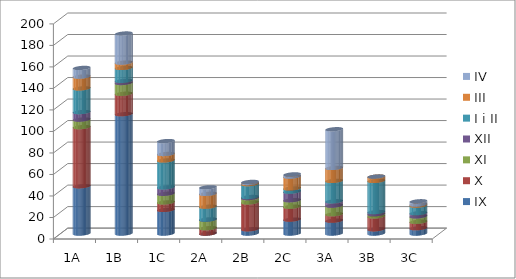
| Category | IX | X  | XI | XII | I i II | III | IV |
|---|---|---|---|---|---|---|---|
| 1A | 44 | 55 | 7 | 7 | 22 | 11 | 8 |
| 1B | 111 | 19 | 10 | 2 | 12 | 5 | 27 |
| 1C | 22 | 7 | 8 | 6 | 25 | 6 | 12 |
| 2A | 0 | 5 | 8 | 0 | 12 | 12 | 6 |
| 2B | 4 | 25 | 4 | 1 | 12 | 1 | 1 |
| 2C | 13 | 12 | 6 | 8 | 3 | 11 | 2 |
| 3A | 12 | 6 | 8 | 4 | 19 | 12 | 36 |
| 3B | 4 | 12 | 2 | 2 | 29 | 4 | 0 |
| 3C | 5 | 6 | 5 | 3 | 7 | 1 | 3 |